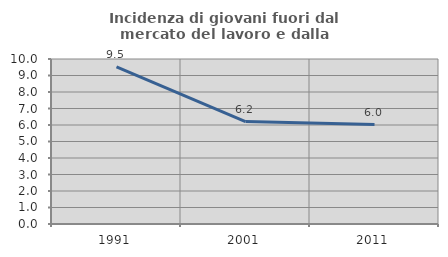
| Category | Incidenza di giovani fuori dal mercato del lavoro e dalla formazione  |
|---|---|
| 1991.0 | 9.524 |
| 2001.0 | 6.211 |
| 2011.0 | 6.024 |